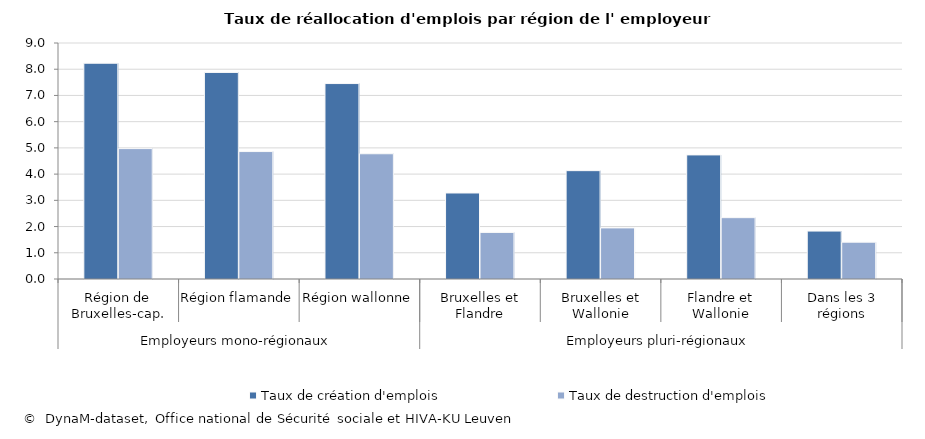
| Category | Taux de création d'emplois | Taux de destruction d'emplois |
|---|---|---|
| 0 | 8.229 | 4.973 |
| 1 | 7.878 | 4.86 |
| 2 | 7.454 | 4.776 |
| 3 | 3.28 | 1.776 |
| 4 | 4.132 | 1.948 |
| 5 | 4.732 | 2.339 |
| 6 | 1.828 | 1.404 |